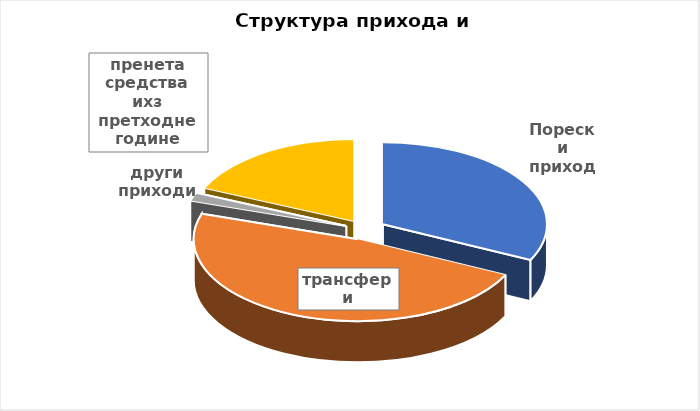
| Category | Series 0 |
|---|---|
| Порески приходи | 61330000 |
| трансфери | 91128000 |
| други приходи | 3085000 |
| пренета средства ихз претходне године | 35000000 |